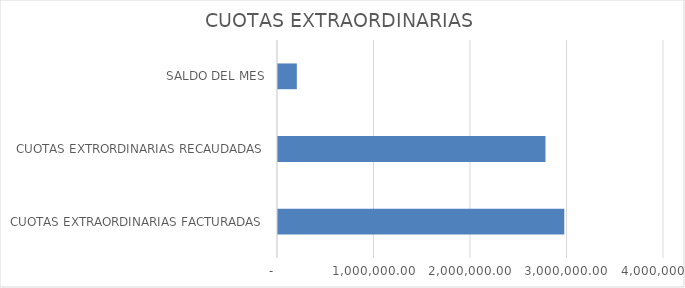
| Category | Series 0 |
|---|---|
| CUOTAS EXTRAORDINARIAS FACTURADAS | 2966820 |
| CUOTAS EXTRORDINARIAS RECAUDADAS | 2771790 |
| SALDO DEL MES | 195030 |